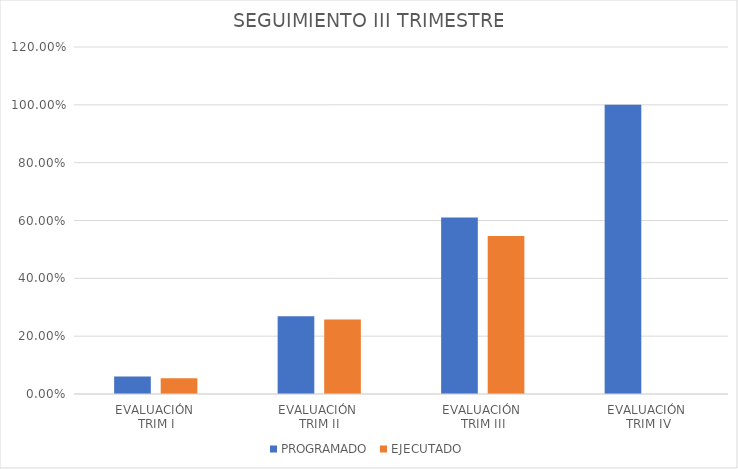
| Category | PROGRAMADO | EJECUTADO |
|---|---|---|
| EVALUACIÓN 
TRIM I | 0.06 | 0.055 |
| EVALUACIÓN 
TRIM II | 0.269 | 0.257 |
| EVALUACIÓN 
TRIM III | 0.61 | 0.547 |
| EVALUACIÓN
 TRIM IV | 1 | 0 |